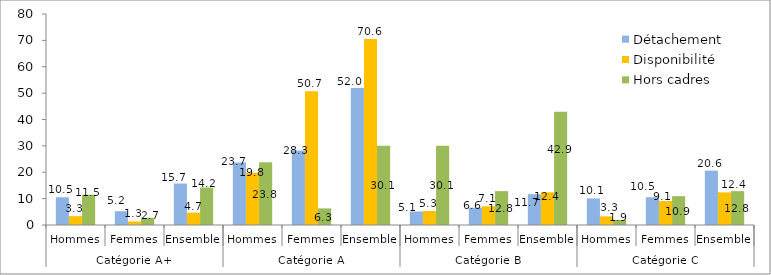
| Category | Détachement | Disponibilité | Hors cadres |
|---|---|---|---|
| 0 | 10.513 | 3.347 | 11.475 |
| 1 | 5.211 | 1.344 | 2.732 |
| 2 | 15.724 | 4.691 | 14.208 |
| 3 | 23.697 | 19.816 | 23.77 |
| 4 | 28.28 | 50.737 | 6.284 |
| 5 | 51.977 | 70.553 | 30.055 |
| 6 | 5.117 | 5.304 | 30.055 |
| 7 | 6.562 | 7.097 | 12.842 |
| 8 | 11.678 | 12.401 | 42.896 |
| 9 | 10.081 | 3.28 | 1.913 |
| 10 | 10.54 | 9.074 | 10.929 |
| 11 | 20.621 | 12.355 | 12.842 |